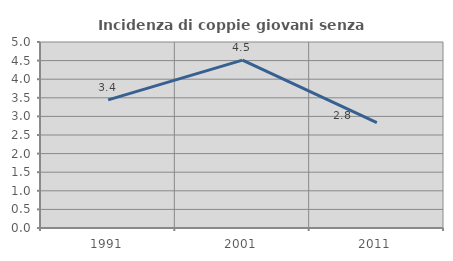
| Category | Incidenza di coppie giovani senza figli |
|---|---|
| 1991.0 | 3.444 |
| 2001.0 | 4.512 |
| 2011.0 | 2.834 |